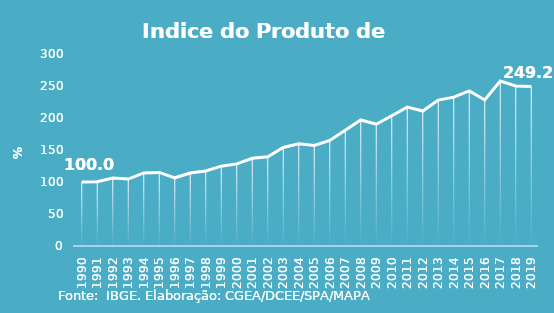
| Category | Indice de Prod. base 1990 |
|---|---|
| 1990.0 | 100 |
| 1991.0 | 100.275 |
| 1992.0 | 106.203 |
| 1993.0 | 104.57 |
| 1994.0 | 114.164 |
| 1995.0 | 115.024 |
| 1996.0 | 106.552 |
| 1997.0 | 114.037 |
| 1998.0 | 117.319 |
| 1999.0 | 124.734 |
| 2000.0 | 128.293 |
| 2001.0 | 136.975 |
| 2002.0 | 139.51 |
| 2003.0 | 153.868 |
| 2004.0 | 159.641 |
| 2005.0 | 157.136 |
| 2006.0 | 164.858 |
| 2007.0 | 180.781 |
| 2008.0 | 196.91 |
| 2009.0 | 190.309 |
| 2010.0 | 203.581 |
| 2011.0 | 217.041 |
| 2012.0 | 210.932 |
| 2013.0 | 228.009 |
| 2014.0 | 232.562 |
| 2015.0 | 242.318 |
| 2016.0 | 228.239 |
| 2017.0 | 257.766 |
| 2018.0 | 250.124 |
| 2019.0 | 249.24 |